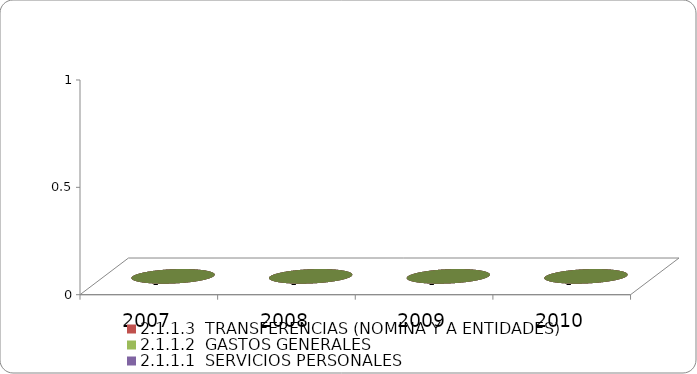
| Category | 2.1.1.1  SERVICIOS PERSONALES | 2.1.1.2  GASTOS GENERALES | 2.1.1.3  TRANSFERENCIAS (NOMINA Y A ENTIDADES) |
|---|---|---|---|
| 2007 | 0 | 0 | 0 |
| 2008 | 0 | 0 | 0 |
| 2009 | 0 | 0 | 0 |
| 2010 | 0 | 0 | 0 |